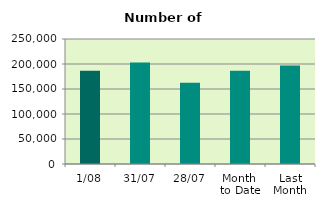
| Category | Series 0 |
|---|---|
| 1/08 | 186692 |
| 31/07 | 203234 |
| 28/07 | 162508 |
| Month 
to Date | 186692 |
| Last
Month | 197154.286 |